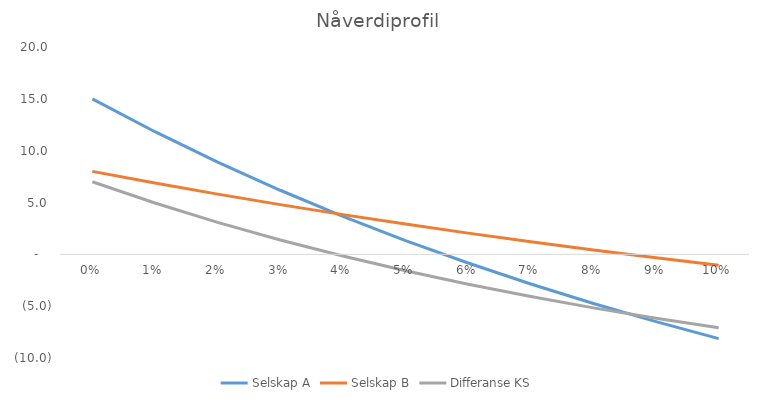
| Category | Selskap A | Selskap B | Differanse KS |
|---|---|---|---|
| 0.0 | 15 | 8 | 7 |
| 0.01 | 11.828 | 6.875 | 4.953 |
| 0.02 | 8.896 | 5.808 | 3.088 |
| 0.03 | 6.181 | 4.795 | 1.387 |
| 0.04 | 3.665 | 3.832 | -0.166 |
| 0.05 | 1.33 | 2.916 | -1.586 |
| 0.06 | -0.839 | 2.045 | -2.885 |
| 0.07 | -2.859 | 1.216 | -4.074 |
| 0.08 | -4.74 | 0.426 | -5.165 |
| 0.09 | -6.494 | -0.327 | -6.167 |
| 0.1 | -8.133 | -1.046 | -7.087 |